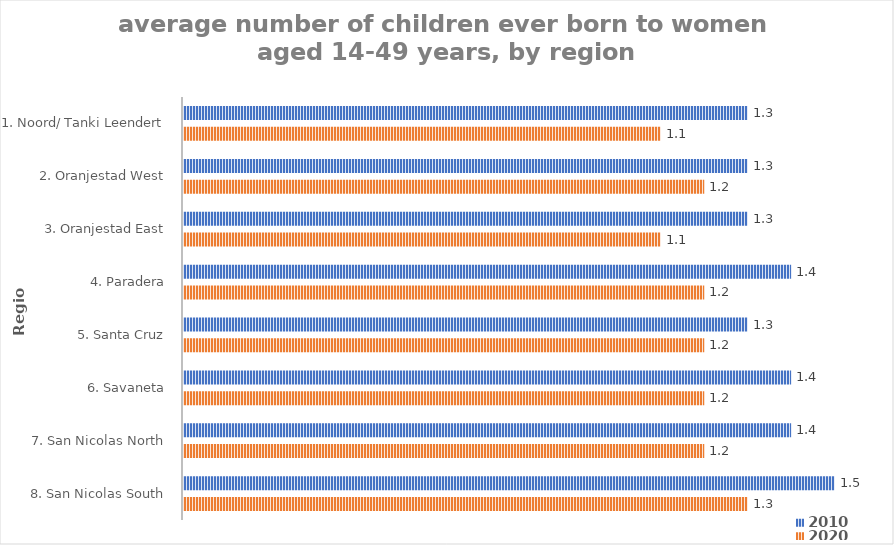
| Category | 2010 | 2020 |
|---|---|---|
| 1. Noord/ Tanki Leendert | 1.3 | 1.1 |
| 2. Oranjestad West | 1.3 | 1.2 |
| 3. Oranjestad East | 1.3 | 1.1 |
| 4. Paradera | 1.4 | 1.2 |
| 5. Santa Cruz | 1.3 | 1.2 |
| 6. Savaneta | 1.4 | 1.2 |
| 7. San Nicolas North | 1.4 | 1.2 |
| 8. San Nicolas South | 1.5 | 1.3 |